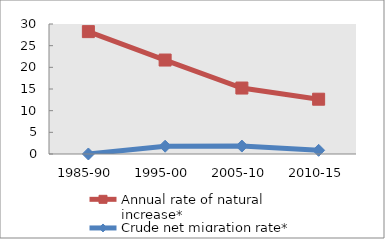
| Category | Annual rate of natural increase* | Crude net migration rate* |
|---|---|---|
| 1985-90 | 28.239 | 0.003 |
| 1995-00 | 21.684 | 1.799 |
| 2005-10 | 15.221 | 1.83 |
| 2010-15 | 12.645 | 0.849 |